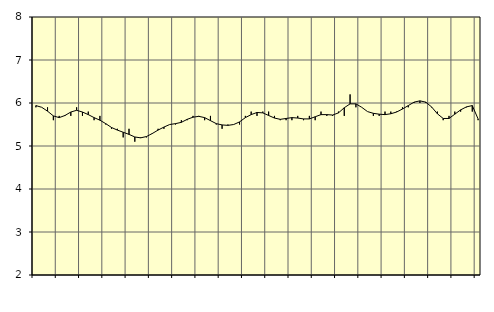
| Category | Piggar | Transport, SNI 49-53 |
|---|---|---|
| nan | 5.9 | 5.94 |
| 1.0 | 5.9 | 5.9 |
| 1.0 | 5.9 | 5.81 |
| 1.0 | 5.6 | 5.7 |
| nan | 5.7 | 5.66 |
| 2.0 | 5.7 | 5.71 |
| 2.0 | 5.7 | 5.79 |
| 2.0 | 5.9 | 5.83 |
| nan | 5.7 | 5.79 |
| 3.0 | 5.8 | 5.73 |
| 3.0 | 5.6 | 5.66 |
| 3.0 | 5.7 | 5.6 |
| nan | 5.5 | 5.52 |
| 4.0 | 5.4 | 5.43 |
| 4.0 | 5.4 | 5.37 |
| 4.0 | 5.2 | 5.32 |
| nan | 5.4 | 5.27 |
| 5.0 | 5.1 | 5.21 |
| 5.0 | 5.2 | 5.19 |
| 5.0 | 5.2 | 5.22 |
| nan | 5.3 | 5.29 |
| 6.0 | 5.4 | 5.37 |
| 6.0 | 5.4 | 5.44 |
| 6.0 | 5.5 | 5.5 |
| nan | 5.5 | 5.52 |
| 7.0 | 5.6 | 5.55 |
| 7.0 | 5.6 | 5.62 |
| 7.0 | 5.7 | 5.67 |
| nan | 5.7 | 5.69 |
| 8.0 | 5.6 | 5.66 |
| 8.0 | 5.7 | 5.59 |
| 8.0 | 5.5 | 5.52 |
| nan | 5.4 | 5.49 |
| 9.0 | 5.5 | 5.48 |
| 9.0 | 5.5 | 5.5 |
| 9.0 | 5.5 | 5.56 |
| nan | 5.7 | 5.66 |
| 10.0 | 5.8 | 5.73 |
| 10.0 | 5.7 | 5.78 |
| 10.0 | 5.8 | 5.77 |
| nan | 5.8 | 5.71 |
| 11.0 | 5.7 | 5.65 |
| 11.0 | 5.6 | 5.62 |
| 11.0 | 5.6 | 5.64 |
| nan | 5.6 | 5.66 |
| 12.0 | 5.7 | 5.65 |
| 12.0 | 5.6 | 5.63 |
| 12.0 | 5.7 | 5.63 |
| nan | 5.6 | 5.68 |
| 13.0 | 5.8 | 5.73 |
| 13.0 | 5.7 | 5.73 |
| 13.0 | 5.7 | 5.72 |
| nan | 5.8 | 5.77 |
| 14.0 | 5.7 | 5.89 |
| 14.0 | 6.2 | 5.98 |
| 14.0 | 5.9 | 5.98 |
| nan | 5.9 | 5.9 |
| 15.0 | 5.8 | 5.8 |
| 15.0 | 5.7 | 5.76 |
| 15.0 | 5.7 | 5.74 |
| nan | 5.8 | 5.73 |
| 16.0 | 5.8 | 5.75 |
| 16.0 | 5.8 | 5.79 |
| 16.0 | 5.9 | 5.86 |
| nan | 5.9 | 5.94 |
| 17.0 | 6 | 6.02 |
| 17.0 | 6 | 6.05 |
| 17.0 | 6 | 6.02 |
| nan | 5.9 | 5.91 |
| 18.0 | 5.8 | 5.75 |
| 18.0 | 5.6 | 5.64 |
| 18.0 | 5.7 | 5.64 |
| nan | 5.8 | 5.74 |
| 19.0 | 5.8 | 5.84 |
| 19.0 | 5.9 | 5.91 |
| 19.0 | 5.8 | 5.94 |
| nan | 5.6 | 5.63 |